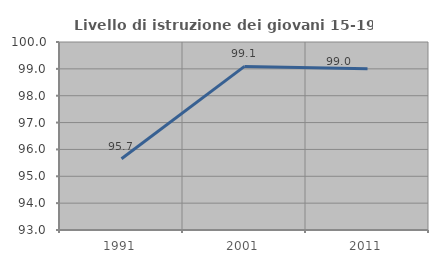
| Category | Livello di istruzione dei giovani 15-19 anni |
|---|---|
| 1991.0 | 95.652 |
| 2001.0 | 99.091 |
| 2011.0 | 99 |